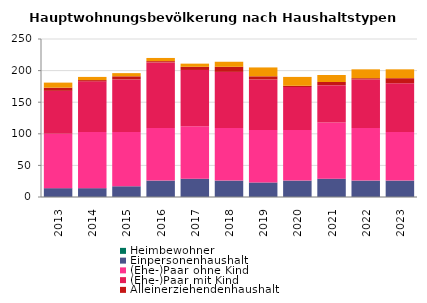
| Category | Heimbewohner | Einpersonenhaushalt | (Ehe-)Paar ohne Kind | (Ehe-)Paar mit Kind | Alleinerziehendenhaushalt | sonstiger Mehrpersonenhaushalt |
|---|---|---|---|---|---|---|
| 2013.0 | 0 | 14 | 86 | 68 | 5 | 8 |
| 2014.0 | 0 | 14 | 89 | 80 | 2 | 5 |
| 2015.0 | 0 | 17 | 86 | 83 | 5 | 5 |
| 2016.0 | 0 | 26 | 83 | 104 | 2 | 5 |
| 2017.0 | 0 | 29 | 83 | 89 | 5 | 5 |
| 2018.0 | 0 | 26 | 83 | 89 | 8 | 8 |
| 2019.0 | 0 | 23 | 83 | 80 | 5 | 14 |
| 2020.0 | 0 | 26 | 80 | 68 | 2 | 14 |
| 2021.0 | 0 | 29 | 89 | 59 | 5 | 11 |
| 2022.0 | 0 | 26 | 83 | 77 | 2 | 14 |
| 2023.0 | 0 | 26 | 77 | 77 | 8 | 14 |